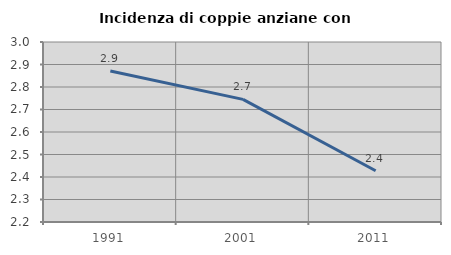
| Category | Incidenza di coppie anziane con figli |
|---|---|
| 1991.0 | 2.871 |
| 2001.0 | 2.745 |
| 2011.0 | 2.428 |